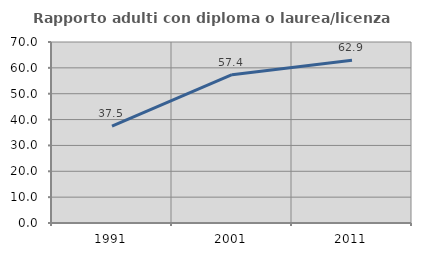
| Category | Rapporto adulti con diploma o laurea/licenza media  |
|---|---|
| 1991.0 | 37.5 |
| 2001.0 | 57.377 |
| 2011.0 | 62.903 |